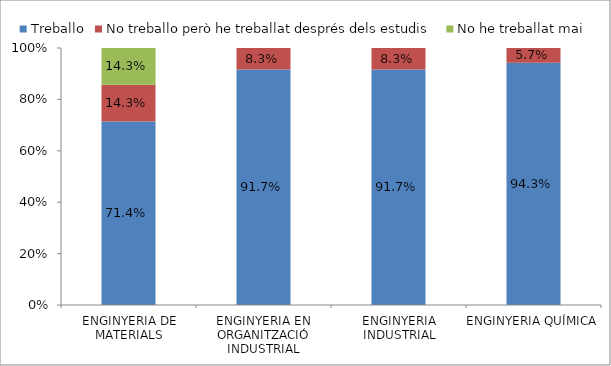
| Category | Treballo | No treballo però he treballat després dels estudis | No he treballat mai |
|---|---|---|---|
| ENGINYERIA DE MATERIALS | 0.714 | 0.143 | 0.143 |
| ENGINYERIA EN ORGANITZACIÓ INDUSTRIAL | 0.917 | 0.083 | 0 |
| ENGINYERIA INDUSTRIAL | 0.917 | 0.083 | 0 |
| ENGINYERIA QUÍMICA | 0.943 | 0.057 | 0 |